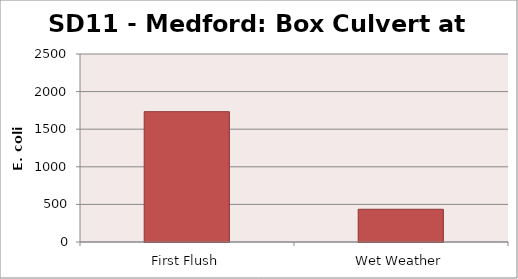
| Category | E. coli MPN - |
|---|---|
| First Flush | 1732.9 |
| Wet Weather | 435.2 |